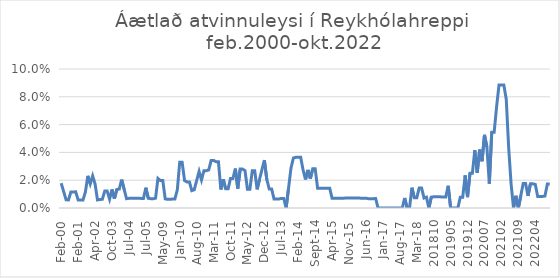
| Category | Áætlað atvinnuleysi |
|---|---|
| feb.00 | 0.018 |
| apr.00 | 0.012 |
| maí.00 | 0.006 |
| júl.00 | 0.006 |
| ágú.00 | 0.012 |
| sep.00 | 0.012 |
| jan.01 | 0.012 |
| feb.01 | 0.006 |
| mar.01 | 0.006 |
| nóv.01 | 0.006 |
| des.01 | 0.011 |
| jan.02 | 0.023 |
| feb.02 | 0.017 |
| mar.02 | 0.023 |
| apr.02 | 0.017 |
| maí.02 | 0.006 |
| okt.02 | 0.006 |
| mar.03 | 0.006 |
| apr.03 | 0.012 |
| maí.03 | 0.012 |
| sep.03 | 0.006 |
| okt.03 | 0.013 |
| nóv.03 | 0.007 |
| des.03 | 0.013 |
| jan.04 | 0.014 |
| feb.04 | 0.02 |
| mar.04 | 0.014 |
| apr.04 | 0.007 |
| júl.04 | 0.007 |
| ágú.04 | 0.007 |
| okt.04 | 0.007 |
| 200501 | 0.007 |
| 200502 | 0.007 |
| apr.05 | 0.007 |
| jún.05 | 0.007 |
| júl.05 | 0.015 |
| ágú.06 | 0.007 |
| júl.07 | 0.007 |
| jún.08 | 0.007 |
| jan.09 | 0.007 |
| feb.09 | 0.021 |
| apr.09 | 0.02 |
| maí.09 | 0.02 |
| jún.09 | 0.007 |
| júl.09 | 0.006 |
| ágú.09 | 0.006 |
| okt.09 | 0.006 |
| nóv.09 | 0.006 |
| des.09 | 0.013 |
| jan.10 | 0.033 |
| feb.10 | 0.033 |
| mar.10 | 0.02 |
| apr.10 | 0.019 |
| maí.10 | 0.019 |
| jún.10 | 0.012 |
| júl.10 | 0.013 |
| ágú.10 | 0.02 |
| sep.10 | 0.026 |
| okt.10 | 0.02 |
| nóv.10 | 0.027 |
| des.10 | 0.027 |
| jan.11 | 0.027 |
| feb.11 | 0.034 |
| mar.11 | 0.034 |
| apr.11 | 0.033 |
| maí.11 | 0.033 |
| jún.11 | 0.013 |
| júl.11 | 0.021 |
| ágú.11 | 0.014 |
| sep.11 | 0.014 |
| okt.11 | 0.021 |
| nóv.11 | 0.021 |
| des.11 | 0.028 |
| jan.12 | 0.014 |
| feb.12 | 0.028 |
| mar.12 | 0.028 |
| apr.12 | 0.027 |
| maí.12 | 0.013 |
| jún.12 | 0.013 |
| júl.12 | 0.027 |
| ágú.12 | 0.027 |
| sep.12 | 0.013 |
| okt.12 | 0.021 |
| nóv.12 | 0.028 |
| des.12 | 0.034 |
| jan.13 | 0.021 |
| feb.13 | 0.014 |
| mar.13 | 0.014 |
| apr.13 | 0.006 |
| maí.13 | 0.006 |
| jún.13 | 0.006 |
| júl.13 | 0.007 |
| ágú.13 | 0.007 |
| sep.13 | 0 |
| okt.13 | 0.014 |
| nóv.13 | 0.029 |
| des.13 | 0.036 |
| jan.14 | 0.036 |
| feb.14 | 0.036 |
| mar.14 | 0.036 |
| apr.14 | 0.027 |
| maí.14 | 0.021 |
| jún.14 | 0.027 |
| júl.14 | 0.021 |
| ágú.14 | 0.028 |
| sep.14 | 0.028 |
| okt.14 | 0.014 |
| nóv.14 | 0.014 |
| des.14 | 0.014 |
| jan.15 | 0.014 |
| feb.15 | 0.014 |
| mar.15 | 0.014 |
| apr.15 | 0.007 |
| maí.15 | 0.007 |
| jún.15 | 0.007 |
| júl.15 | 0.007 |
| ágú.15 | 0.007 |
| sep.15 | 0.007 |
| okt.15 | 0.007 |
| nóv.15 | 0.007 |
| des.15 | 0.007 |
| jan.16 | 0.007 |
| feb.16 | 0.007 |
| mar.16 | 0.007 |
| apr.16 | 0.007 |
| maí.16 | 0.007 |
| jún.16 | 0.007 |
| júl.16 | 0.007 |
| ágú.16 | 0.007 |
| sep.16 | 0.007 |
| okt.16 | 0.007 |
| nóv.16 | 0 |
| des.16 | 0 |
| jan.17 | 0 |
| feb.17 | 0 |
| mar.17 | 0 |
| apr.17 | 0 |
| maí.17 | 0 |
| jún.17 | 0 |
| júl.17 | 0 |
| ágú.17 | 0 |
| sep.17 | 0 |
| okt.17 | 0.007 |
| nóv.17 | 0 |
| des.17 | 0 |
| jan.18 | 0.015 |
| feb.18 | 0.007 |
| mar.18 | 0.007 |
| apr.18 | 0.014 |
| maí.18 | 0.014 |
| jún.18 | 0.007 |
| júl.18 | 0.008 |
| ágú.18 | 0 |
| 201809 | 0.008 |
| 201810 | 0.008 |
| 201811 | 0.008 |
| 201812 | 0.008 |
| 201901 | 0.008 |
| 201902 | 0.008 |
| 201903 | 0.008 |
| 201904 | 0.016 |
| 201905 | 0 |
| 201906 | 0 |
| 201907 | 0 |
| 201908 | 0 |
| 201909 | 0.008 |
| 201910 | 0.008 |
| 201911 | 0.023 |
| 201912 | 0.008 |
| 202001 | 0.025 |
| 202002 | 0.025 |
| 202003 | 0.042 |
| 202004 | 0.025 |
| 202005 | 0.042 |
| 202006 | 0.034 |
| 202007 | 0.053 |
| 202008 | 0.044 |
| 202009 | 0.018 |
| 202010 | 0.055 |
| 202011 | 0.055 |
| 202012 | 0.073 |
| 202101 | 0.088 |
| 202102 | 0.088 |
| 202103 | 0.088 |
| 202104 | 0.078 |
| 202105 | 0.043 |
| 202106 | 0.017 |
| 202107 | 0 |
| 202108 | 0.009 |
| 202109 | 0 |
| 202110 | 0.009 |
| 202111 | 0.018 |
| 202112 | 0.018 |
| 202201 | 0.009 |
| 202202 | 0.017 |
| 202203 | 0.017 |
| 202204 | 0.017 |
| 202205 | 0.008 |
| 202206 | 0.008 |
| 202207 | 0.008 |
| 202208 | 0.009 |
| 202209 | 0.017 |
| 202210 | 0.017 |